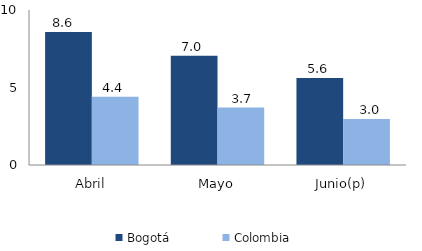
| Category | Bogotá | Colombia |
|---|---|---|
| Abril | 8.576 | 4.404 |
| Mayo | 7.045 | 3.709 |
| Junio(p) | 5.615 | 2.968 |